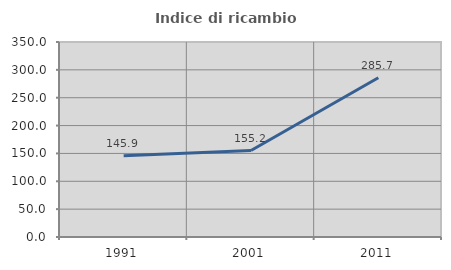
| Category | Indice di ricambio occupazionale  |
|---|---|
| 1991.0 | 145.923 |
| 2001.0 | 155.191 |
| 2011.0 | 285.714 |